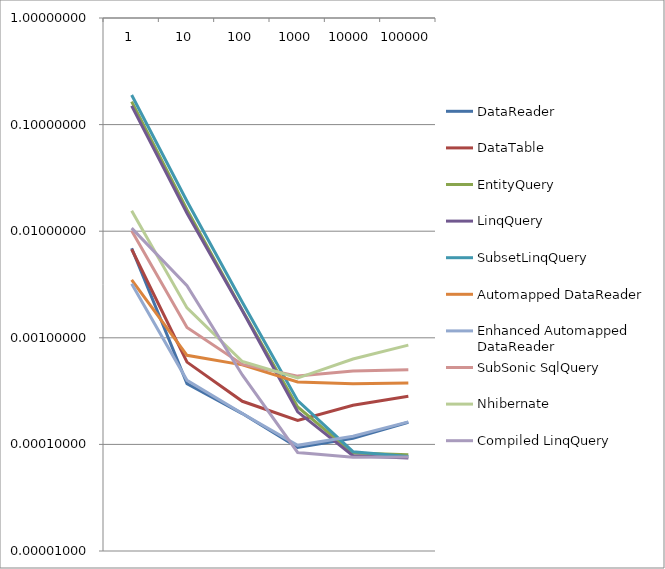
| Category | DataReader | DataTable | EntityQuery | LinqQuery | SubsetLinqQuery | Automapped DataReader | Enhanced Automapped DataReader | SubSonic SqlQuery | Nhibernate | Compiled LinqQuery |
|---|---|---|---|---|---|---|---|---|---|---|
| 1.0 | 0.007 | 0.007 | 0.164 | 0.15 | 0.19 | 0.003 | 0.003 | 0.01 | 0.016 | 0.011 |
| 10.0 | 0 | 0.001 | 0.016 | 0.015 | 0.019 | 0.001 | 0 | 0.001 | 0.002 | 0.003 |
| 100.0 | 0 | 0 | 0.002 | 0.002 | 0.002 | 0.001 | 0 | 0.001 | 0.001 | 0 |
| 1000.0 | 0 | 0 | 0 | 0 | 0 | 0 | 0 | 0 | 0 | 0 |
| 10000.0 | 0 | 0 | 0 | 0 | 0 | 0 | 0 | 0 | 0.001 | 0 |
| 100000.0 | 0 | 0 | 0 | 0 | 0 | 0 | 0 | 0.001 | 0.001 | 0 |